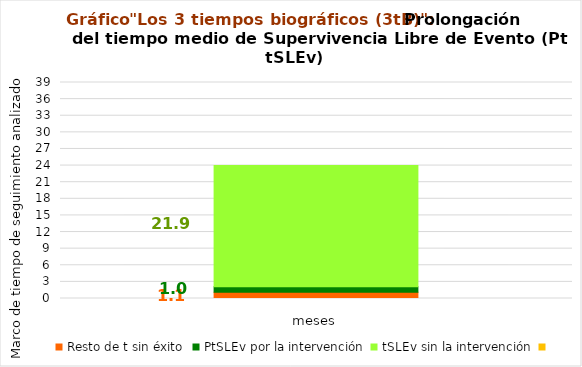
| Category | Resto de t sin éxito | PtSLEv por la intervención | tSLEv sin la intervención | Series 3 |
|---|---|---|---|---|
| 0 | 1.137 | 0.976 | 21.887 |  |